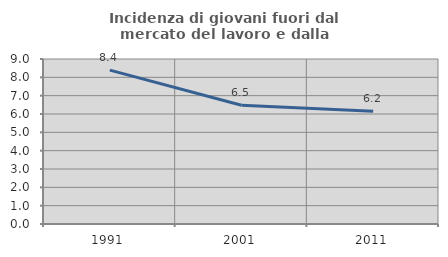
| Category | Incidenza di giovani fuori dal mercato del lavoro e dalla formazione  |
|---|---|
| 1991.0 | 8.392 |
| 2001.0 | 6.475 |
| 2011.0 | 6.154 |